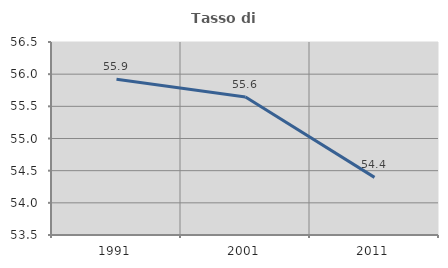
| Category | Tasso di occupazione   |
|---|---|
| 1991.0 | 55.922 |
| 2001.0 | 55.646 |
| 2011.0 | 54.396 |